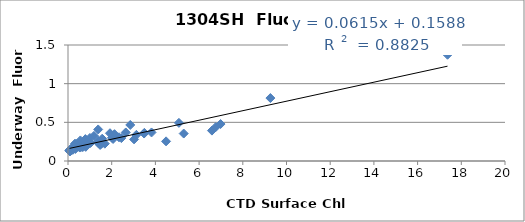
| Category | Series 0 |
|---|---|
| 2.85 | 0.466 |
| 1.387 | 0.26 |
| 0.812 | 0.183 |
| 0.185 | 0.145 |
| 0.228 | 0.146 |
| 0.339 | 0.156 |
| 0.64 | 0.183 |
| 0.566 | 0.266 |
| 0.325 | 0.167 |
| 0.737 | 0.209 |
| 4.489 | 0.254 |
| 1.469 | 0.208 |
| 1.407 | 0.227 |
| 2.334 | 0.307 |
| 3.496 | 0.364 |
| 3.13 | 0.338 |
| 3.024 | 0.28 |
| 2.012 | 0.301 |
| 1.686 | 0.224 |
| 0.728 | 0.257 |
| 0.39 | 0.197 |
| 0.363 | 0.182 |
| 0.164 | 0.156 |
| 0.147 | 0.161 |
| 0.119 | 0.147 |
| 0.073 | 0.135 |
| 0.075 | 0.14 |
| 0.106 | 0.135 |
| 0.091 | 0.13 |
| 0.091 | 0.135 |
| 0.11 | 0.135 |
| 0.556 | 0.228 |
| 0.612 | 0.191 |
| 1.029 | 0.233 |
| 2.128 | 0.347 |
| 0.539 | 0.174 |
| 2.063 | 0.285 |
| 6.76 | 0.438 |
| 3.823 | 0.369 |
| 6.982 | 0.478 |
| 5.296 | 0.355 |
| 1.566 | 0.288 |
| 0.564 | 0.184 |
| 0.519 | 0.196 |
| 0.187 | 0.159 |
| 0.076 | 0.132 |
| 0.094 | 0.124 |
| 0.38 | 0.211 |
| 0.283 | 0.193 |
| 0.555 | 0.198 |
| 0.677 | 0.181 |
| 2.442 | 0.296 |
| 6.588 | 0.393 |
| 1.527 | 0.223 |
| 0.685 | 0.206 |
| 0.606 | 0.186 |
| 0.233 | 0.16 |
| 0.358 | 0.207 |
| 0.131 | 0.147 |
| 0.294 | 0.183 |
| 0.485 | 0.204 |
| 5.075 | 0.493 |
| 3.483 | 0.355 |
| 9.263 | 0.814 |
| 1.922 | 0.359 |
| 1.003 | 0.298 |
| 1.188 | 0.325 |
| 0.423 | 0.223 |
| 0.451 | 0.218 |
| 0.32 | 0.224 |
| 0.422 | 0.208 |
| 0.795 | 0.283 |
| 0.522 | 0.212 |
| 2.644 | 0.369 |
| 1.381 | 0.408 |
| 17.369 | 1.374 |